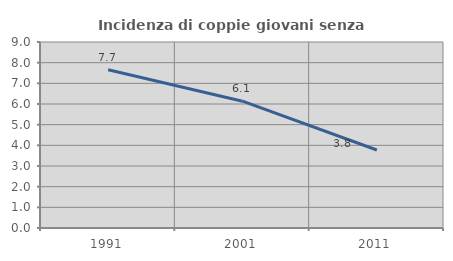
| Category | Incidenza di coppie giovani senza figli |
|---|---|
| 1991.0 | 7.657 |
| 2001.0 | 6.135 |
| 2011.0 | 3.773 |